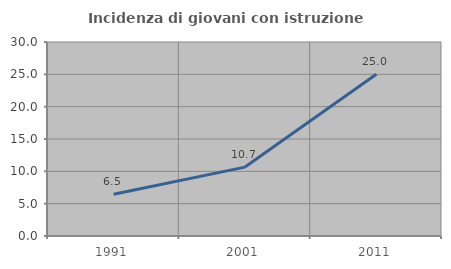
| Category | Incidenza di giovani con istruzione universitaria |
|---|---|
| 1991.0 | 6.459 |
| 2001.0 | 10.655 |
| 2011.0 | 25.018 |